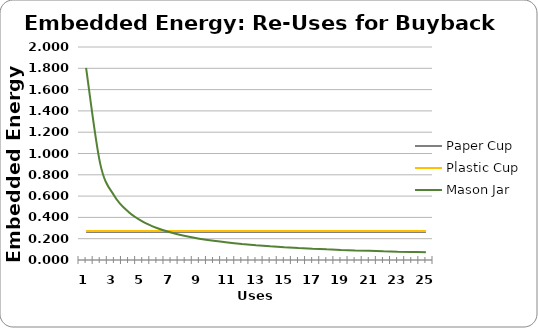
| Category | Paper Cup | Plastic Cup | Mason Jar |
|---|---|---|---|
| 0 | 0.262 | 0.273 | 1.805 |
| 1 | 0.262 | 0.273 | 0.902 |
| 2 | 0.262 | 0.273 | 0.602 |
| 3 | 0.262 | 0.273 | 0.451 |
| 4 | 0.262 | 0.273 | 0.361 |
| 5 | 0.262 | 0.273 | 0.301 |
| 6 | 0.262 | 0.273 | 0.258 |
| 7 | 0.262 | 0.273 | 0.226 |
| 8 | 0.262 | 0.273 | 0.201 |
| 9 | 0.262 | 0.273 | 0.18 |
| 10 | 0.262 | 0.273 | 0.164 |
| 11 | 0.262 | 0.273 | 0.15 |
| 12 | 0.262 | 0.273 | 0.139 |
| 13 | 0.262 | 0.273 | 0.129 |
| 14 | 0.262 | 0.273 | 0.12 |
| 15 | 0.262 | 0.273 | 0.113 |
| 16 | 0.262 | 0.273 | 0.106 |
| 17 | 0.262 | 0.273 | 0.1 |
| 18 | 0.262 | 0.273 | 0.095 |
| 19 | 0.262 | 0.273 | 0.09 |
| 20 | 0.262 | 0.273 | 0.086 |
| 21 | 0.262 | 0.273 | 0.082 |
| 22 | 0.262 | 0.273 | 0.078 |
| 23 | 0.262 | 0.273 | 0.075 |
| 24 | 0.262 | 0.273 | 0.072 |